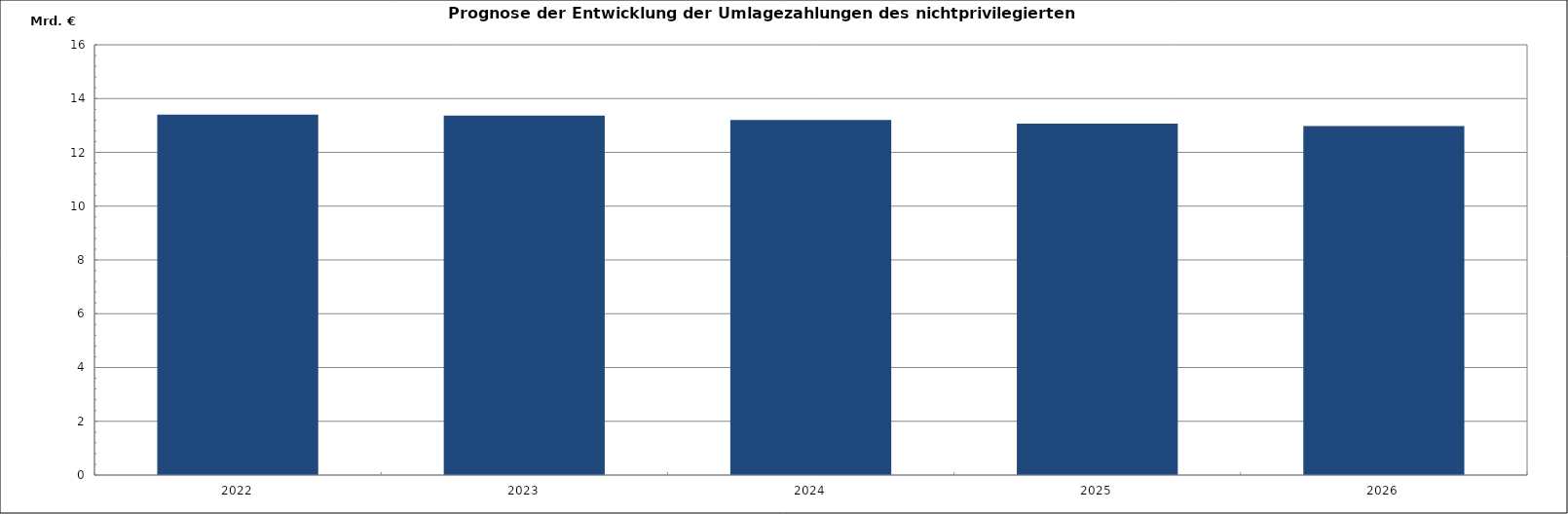
| Category | Gesamt |
|---|---|
| 2022.0 | 13399.831 |
| 2023.0 | 13369.792 |
| 2024.0 | 13202.265 |
| 2025.0 | 13071.673 |
| 2026.0 | 12973.515 |